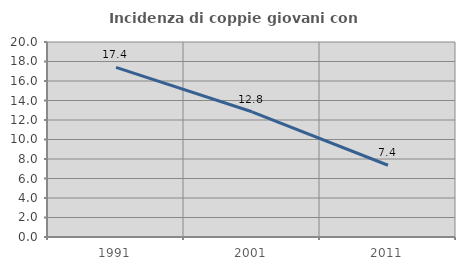
| Category | Incidenza di coppie giovani con figli |
|---|---|
| 1991.0 | 17.401 |
| 2001.0 | 12.842 |
| 2011.0 | 7.357 |